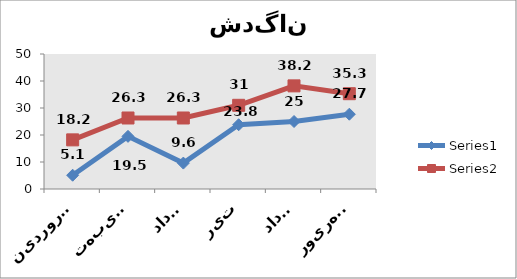
| Category | Series 0 | Series 1 |
|---|---|---|
| فروردین | 5.1 | 18.2 |
| اردیبهت | 19.5 | 26.3 |
| خرداد | 9.6 | 26.3 |
| تیر | 23.8 | 31 |
| مرداد | 25 | 38.2 |
| شهریور | 27.7 | 35.3 |